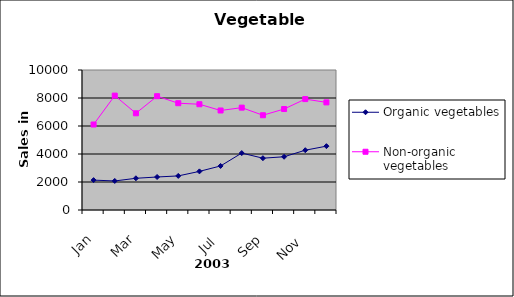
| Category | Organic vegetables | Non-organic vegetables |
|---|---|---|
| Jan | 2134.395 | 6106.116 |
| Feb | 2073.697 | 8170.14 |
| Mar | 2264.738 | 6907.452 |
| Apr | 2357.655 | 8128.404 |
| May | 2434.238 | 7628.244 |
| Jun | 2758.672 | 7554.384 |
| Jul | 3146.67 | 7108.116 |
| Aug | 4066.237 | 7311.348 |
| Sep | 3700.658 | 6767.88 |
| Oct | 3802.462 | 7212.516 |
| Nov | 4270.822 | 7921.848 |
| Dec | 4559.655 | 7687.068 |